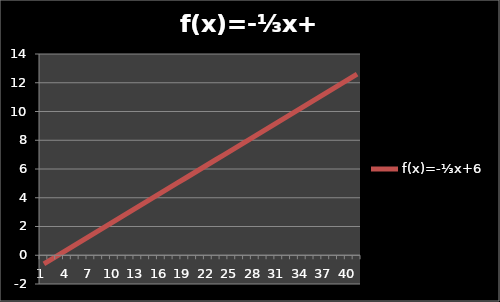
| Category | f(x)=-⅓x+6 |
|---|---|
| 0 | -0.6 |
| 1 | -0.27 |
| 2 | 0.06 |
| 3 | 0.39 |
| 4 | 0.72 |
| 5 | 1.05 |
| 6 | 1.38 |
| 7 | 1.71 |
| 8 | 2.04 |
| 9 | 2.37 |
| 10 | 2.7 |
| 11 | 3.03 |
| 12 | 3.36 |
| 13 | 3.69 |
| 14 | 4.02 |
| 15 | 4.35 |
| 16 | 4.68 |
| 17 | 5.01 |
| 18 | 5.34 |
| 19 | 5.67 |
| 20 | 6 |
| 21 | 6.33 |
| 22 | 6.66 |
| 23 | 6.99 |
| 24 | 7.32 |
| 25 | 7.65 |
| 26 | 7.98 |
| 27 | 8.31 |
| 28 | 8.64 |
| 29 | 8.97 |
| 30 | 9.3 |
| 31 | 9.63 |
| 32 | 9.96 |
| 33 | 10.29 |
| 34 | 10.62 |
| 35 | 10.95 |
| 36 | 11.28 |
| 37 | 11.61 |
| 38 | 11.94 |
| 39 | 12.27 |
| 40 | 12.6 |